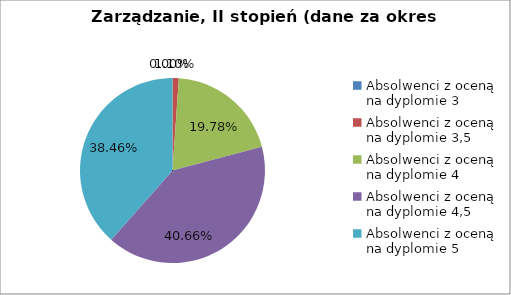
| Category | Series 0 |
|---|---|
| Absolwenci z oceną na dyplomie 3 | 0 |
| Absolwenci z oceną na dyplomie 3,5 | 1.099 |
| Absolwenci z oceną na dyplomie 4 | 19.78 |
| Absolwenci z oceną na dyplomie 4,5 | 40.659 |
| Absolwenci z oceną na dyplomie 5 | 38.462 |